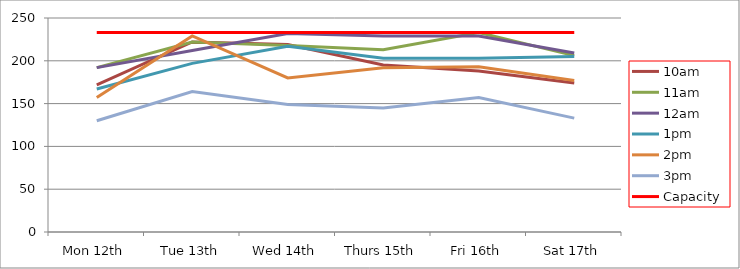
| Category | 9am | 10am | 11am | 12am | 1pm | 2pm | 3pm | 4pm | 5pm | Capacity |
|---|---|---|---|---|---|---|---|---|---|---|
| Mon 12th |  | 172 | 192 | 192 | 167 | 157 | 130 |  |  | 233 |
| Tue 13th |  | 222 | 222 | 212 | 197 | 229 | 164 |  |  | 233 |
| Wed 14th |  | 219 | 218 | 232 | 217 | 180 | 149 |  |  | 233 |
| Thurs 15th |  | 195 | 213 | 229 | 203 | 192 | 145 |  |  | 233 |
| Fri 16th |  | 188 | 233 | 229 | 203 | 193 | 157 |  |  | 233 |
| Sat 17th |  | 174 | 206 | 209 | 205 | 177 | 133 |  |  | 233 |